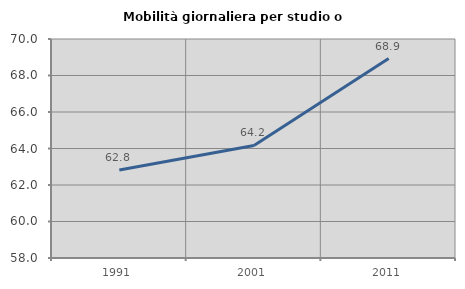
| Category | Mobilità giornaliera per studio o lavoro |
|---|---|
| 1991.0 | 62.819 |
| 2001.0 | 64.168 |
| 2011.0 | 68.927 |